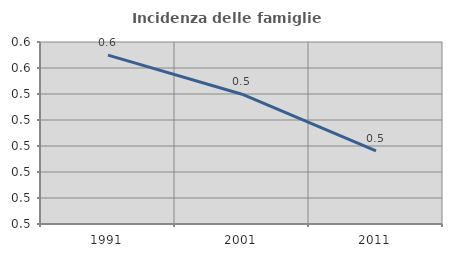
| Category | Incidenza delle famiglie numerose |
|---|---|
| 1991.0 | 0.552 |
| 2001.0 | 0.545 |
| 2011.0 | 0.534 |